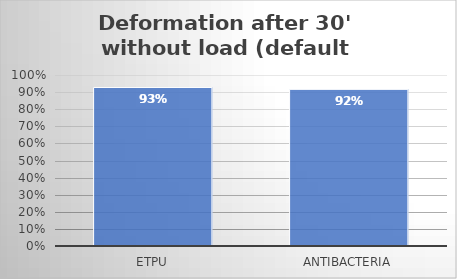
| Category | % |
|---|---|
| eTPU | 0.927 |
| Antibacteria | 0.916 |